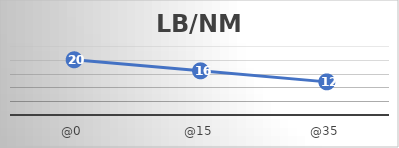
| Category | LB/NM |
|---|---|
| @0 | 20 |
| @15 | 16 |
| @35 | 12 |